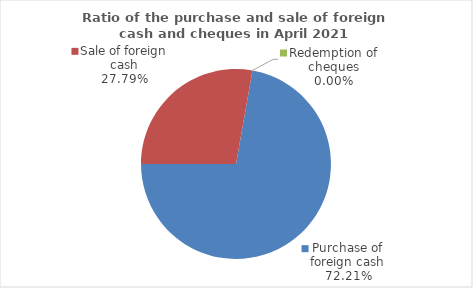
| Category | Series 0 |
|---|---|
| Purchase of foreign cash | 72.206 |
| Sale of foreign cash | 27.794 |
| Redemption of cheques | 0 |